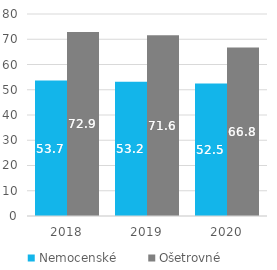
| Category | Nemocenské  | Ošetrovné |
|---|---|---|
| 2018.0 | 53.681 | 72.876 |
| 2019.0 | 53.166 | 71.593 |
| 2020.0 | 52.478 | 66.774 |